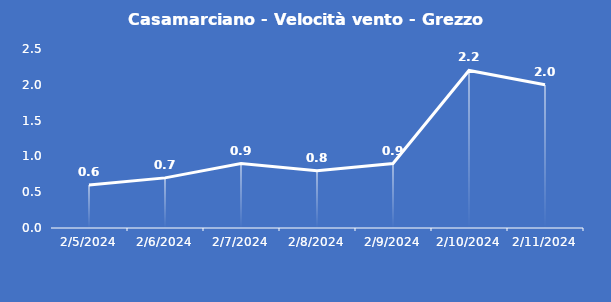
| Category | Casamarciano - Velocità vento - Grezzo (m/s) |
|---|---|
| 2/5/24 | 0.6 |
| 2/6/24 | 0.7 |
| 2/7/24 | 0.9 |
| 2/8/24 | 0.8 |
| 2/9/24 | 0.9 |
| 2/10/24 | 2.2 |
| 2/11/24 | 2 |